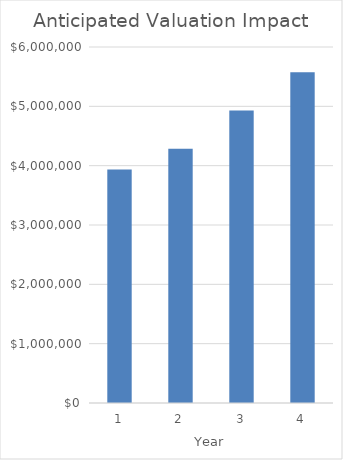
| Category | Valuation |
|---|---|
| 1.0 | 3937500 |
| 2.0 | 4286306.25 |
| 3.0 | 4930256.25 |
| 4.0 | 5574206.25 |